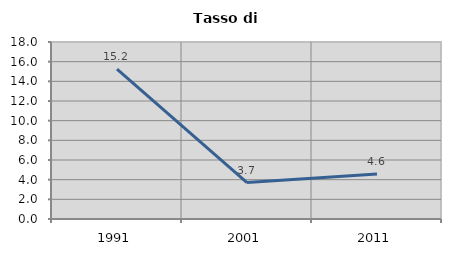
| Category | Tasso di disoccupazione   |
|---|---|
| 1991.0 | 15.238 |
| 2001.0 | 3.704 |
| 2011.0 | 4.575 |